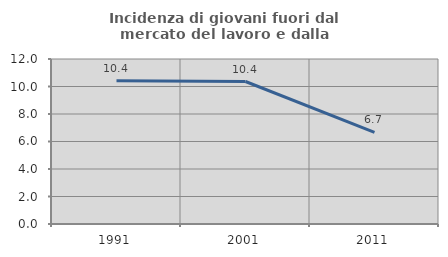
| Category | Incidenza di giovani fuori dal mercato del lavoro e dalla formazione  |
|---|---|
| 1991.0 | 10.413 |
| 2001.0 | 10.363 |
| 2011.0 | 6.667 |